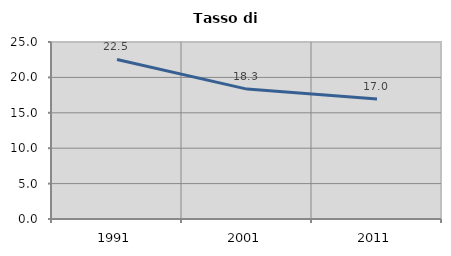
| Category | Tasso di disoccupazione   |
|---|---|
| 1991.0 | 22.535 |
| 2001.0 | 18.349 |
| 2011.0 | 16.964 |